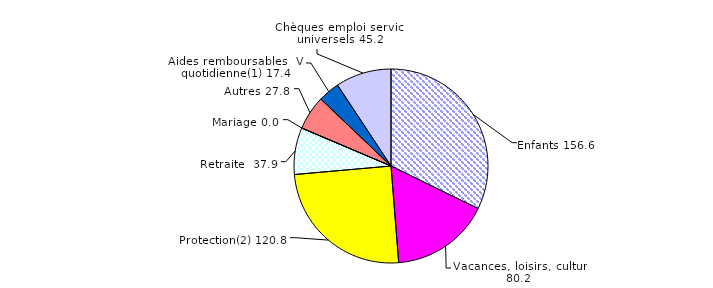
| Category | Series 0 |
|---|---|
| Enfants | 156.6 |
| Vacances, loisirs, culture | 80.2 |
| Protection(2) | 120.8 |
| Retraite  | 37.9 |
| Mariage | 0 |
| Autres | 27.8 |
| Aides remboursables  Vie quotidienne(1) | 17.4 |
| Chèques emploi service universels | 45.2 |